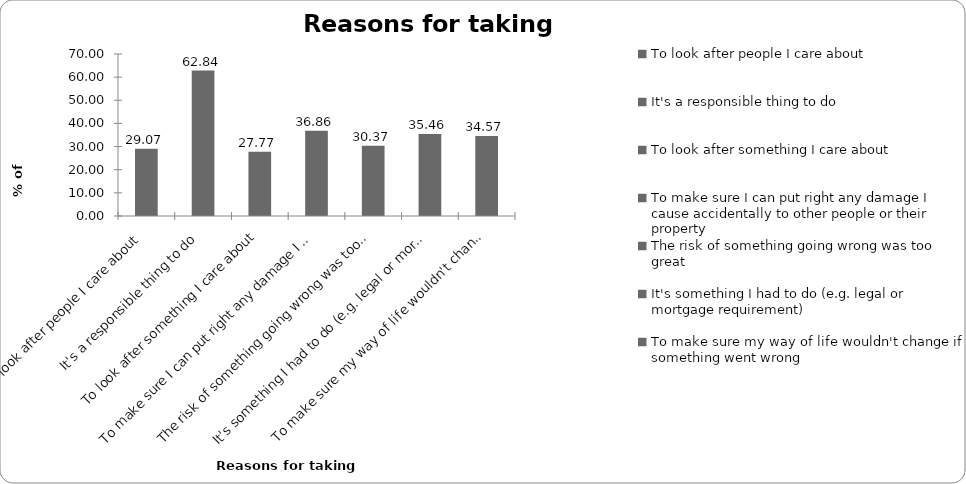
| Category | Reasons for taking insurance |
|---|---|
| To look after people I care about | 29.071 |
| It's a responsible thing to do | 62.837 |
| To look after something I care about | 27.772 |
| To make sure I can put right any damage I cause accidentally to other people or their property | 36.863 |
| The risk of something going wrong was too great | 30.37 |
| It's something I had to do (e.g. legal or mortgage requirement) | 35.465 |
| To make sure my way of life wouldn't change if something went wrong | 34.565 |